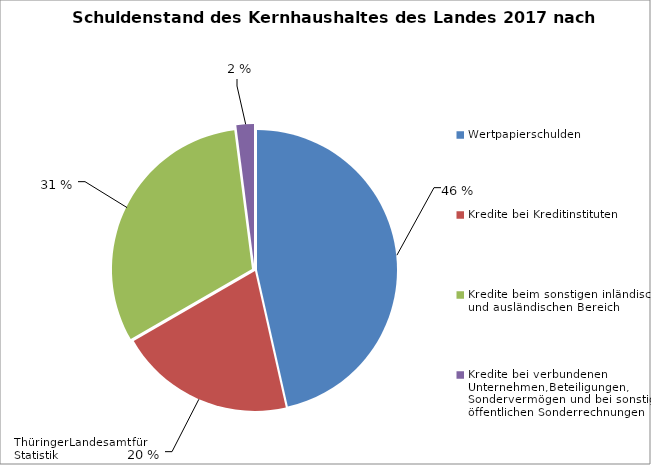
| Category | Series 0 |
|---|---|
| Wertpapierschulden | 46 |
| Kredite bei Kreditinstituten | 20 |
| Kredite beim sonstigen inländischen und ausländischen Bereich | 31 |
| Kredite bei verbundenen Unternehmen,Beteiligungen, Sondervermögen und bei sonstigen öffentlichen Sonderrechnungen | 2 |